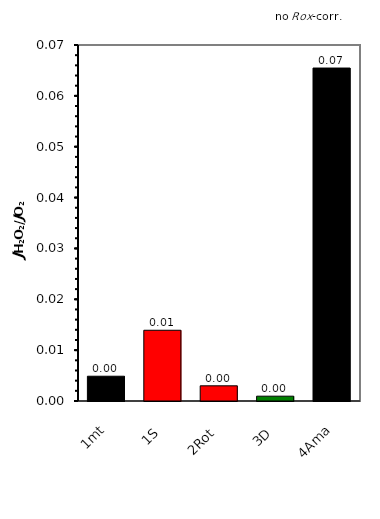
| Category | no ROX-corr. |
|---|---|
| 1mt | 0.005 |
| 1S | 0.014 |
| 2Rot | 0.003 |
| 3D | 0.001 |
| 4Ama | 0.065 |